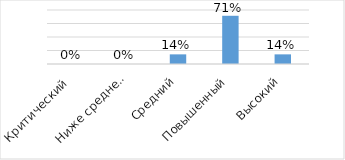
| Category | Series 0 |
|---|---|
| Критический  | 0 |
| Ниже среднего | 0 |
| Средний | 0.143 |
| Повышенный | 0.714 |
| Высокий | 0.143 |